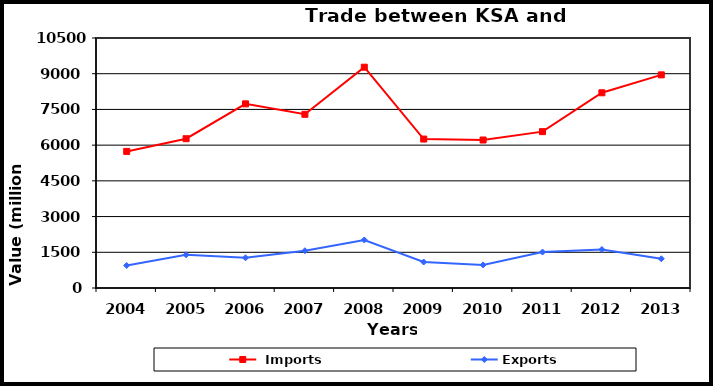
| Category |  Imports | Exports |
|---|---|---|
| 2004.0 | 5737 | 946 |
| 2005.0 | 6270 | 1394 |
| 2006.0 | 7734 | 1269 |
| 2007.0 | 7296 | 1565 |
| 2008.0 | 9274 | 2018 |
| 2009.0 | 6256 | 1091 |
| 2010.0 | 6216 | 970 |
| 2011.0 | 6567 | 1510 |
| 2012.0 | 8199 | 1616 |
| 2013.0 | 8952 | 1227 |